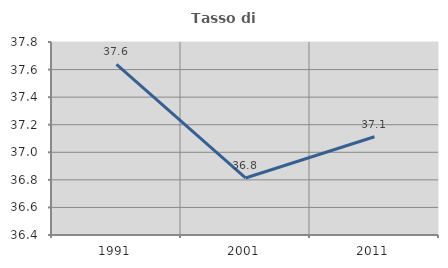
| Category | Tasso di occupazione   |
|---|---|
| 1991.0 | 37.637 |
| 2001.0 | 36.814 |
| 2011.0 | 37.113 |